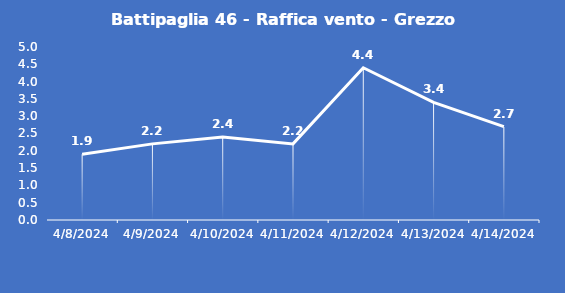
| Category | Battipaglia 46 - Raffica vento - Grezzo (m/s) |
|---|---|
| 4/8/24 | 1.9 |
| 4/9/24 | 2.2 |
| 4/10/24 | 2.4 |
| 4/11/24 | 2.2 |
| 4/12/24 | 4.4 |
| 4/13/24 | 3.4 |
| 4/14/24 | 2.7 |